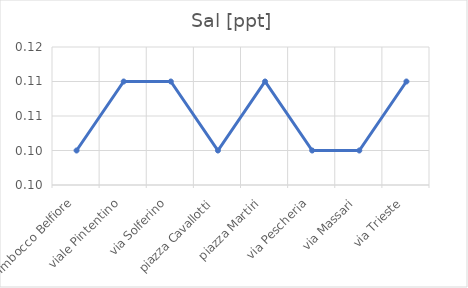
| Category | Sal [ppt] |
|---|---|
| Imbocco Belfiore | 0.1 |
| viale Pintentino | 0.11 |
| via Solferino | 0.11 |
| piazza Cavallotti | 0.1 |
| piazza Martiri | 0.11 |
| via Pescheria | 0.1 |
| via Massari | 0.1 |
| via Trieste | 0.11 |